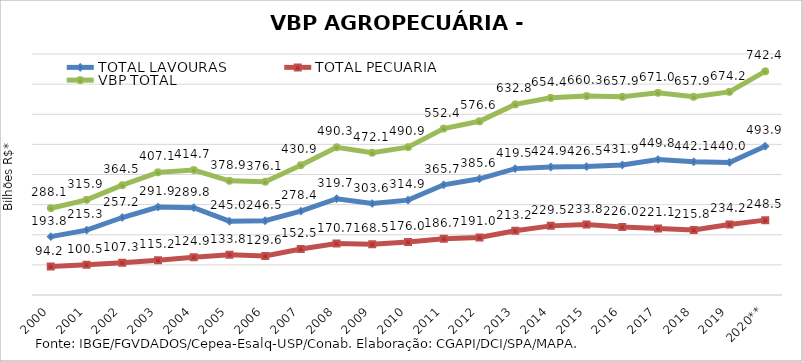
| Category | TOTAL LAVOURAS | TOTAL PECUÁRIA | VBP TOTAL |
|---|---|---|---|
| 2000 | 193.847 | 94.227 | 288.074 |
| 2001 | 215.328 | 100.528 | 315.856 |
| 2002 | 257.217 | 107.315 | 364.531 |
| 2003 | 291.939 | 115.184 | 407.123 |
| 2004 | 289.802 | 124.941 | 414.743 |
| 2005 | 245.014 | 133.843 | 378.857 |
| 2006 | 246.511 | 129.628 | 376.139 |
| 2007 | 278.389 | 152.5 | 430.89 |
| 2008 | 319.66 | 170.684 | 490.344 |
| 2009 | 303.634 | 168.464 | 472.098 |
| 2010 | 314.903 | 176.012 | 490.915 |
| 2011 | 365.72 | 186.704 | 552.424 |
| 2012 | 385.608 | 190.987 | 576.595 |
| 2013 | 419.544 | 213.214 | 632.758 |
| 2014 | 424.942 | 229.479 | 654.42 |
| 2015 | 426.483 | 233.776 | 660.26 |
| 2016 | 431.876 | 226.003 | 657.879 |
| 2017 | 449.82 | 221.147 | 670.967 |
| 2018 | 442.13 | 215.799 | 657.929 |
| 2019 | 440.012 | 234.194 | 674.206 |
| 2020** | 493.915 | 248.517 | 742.433 |